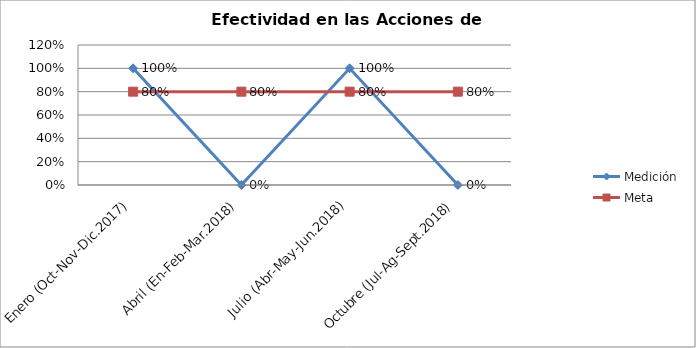
| Category | Medición | Meta |
|---|---|---|
| Enero (Oct-Nov-Dic.2017) | 1 | 0.8 |
| Abril (En-Feb-Mar.2018) | 0 | 0.8 |
| Julio (Abr-May-Jun.2018) | 1 | 0.8 |
| Octubre (Jul-Ag-Sept.2018) | 0 | 0.8 |